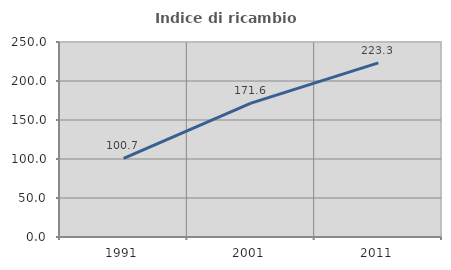
| Category | Indice di ricambio occupazionale  |
|---|---|
| 1991.0 | 100.749 |
| 2001.0 | 171.635 |
| 2011.0 | 223.288 |